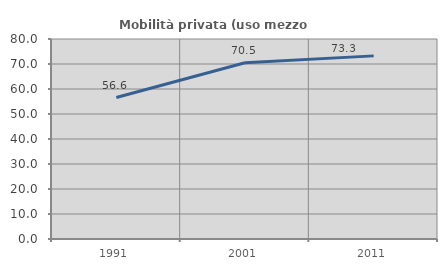
| Category | Mobilità privata (uso mezzo privato) |
|---|---|
| 1991.0 | 56.586 |
| 2001.0 | 70.489 |
| 2011.0 | 73.251 |